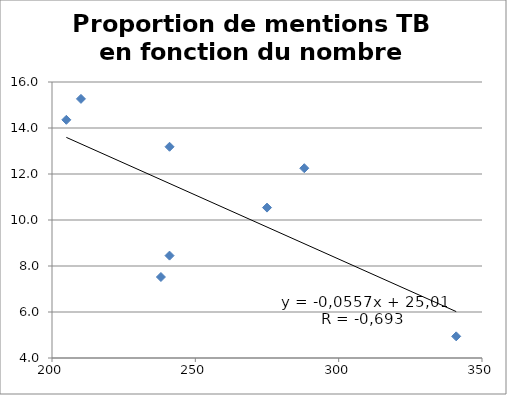
| Category | Proportion de mentions TB en fonction du nombre d'Alison |
|---|---|
| 341.0 | 4.941 |
| 238.0 | 7.521 |
| 241.0 | 8.451 |
| 275.0 | 10.539 |
| 288.0 | 12.251 |
| 241.0 | 13.185 |
| 205.0 | 14.356 |
| 210.09899999999834 | 15.266 |